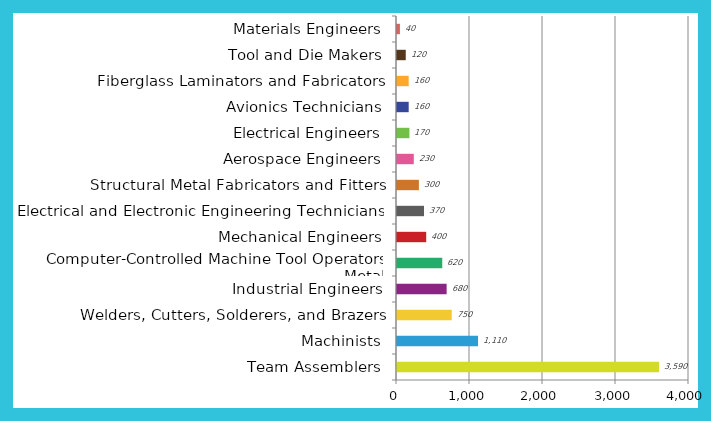
| Category | Series 0 |
|---|---|
| Team Assemblers | 3590 |
| Machinists | 1110 |
| Welders, Cutters, Solderers, and Brazers | 750 |
| Industrial Engineers | 680 |
| Computer-Controlled Machine Tool Operators, Metal | 620 |
| Mechanical Engineers | 400 |
| Electrical and Electronic Engineering Technicians | 370 |
| Structural Metal Fabricators and Fitters | 300 |
| Aerospace Engineers | 230 |
| Electrical Engineers | 170 |
| Avionics Technicians | 160 |
| Fiberglass Laminators and Fabricators | 160 |
| Tool and Die Makers | 120 |
| Materials Engineers | 40 |